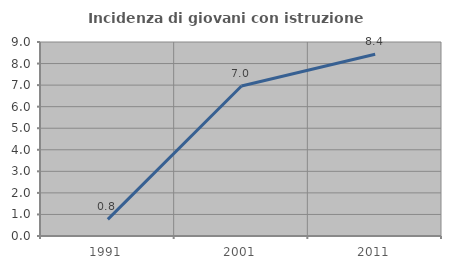
| Category | Incidenza di giovani con istruzione universitaria |
|---|---|
| 1991.0 | 0.769 |
| 2001.0 | 6.957 |
| 2011.0 | 8.434 |